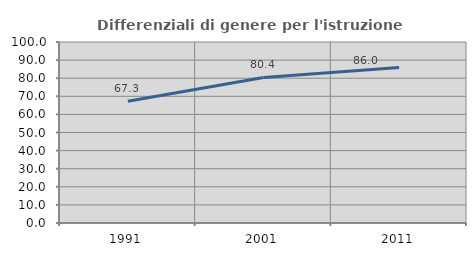
| Category | Differenziali di genere per l'istruzione superiore |
|---|---|
| 1991.0 | 67.315 |
| 2001.0 | 80.397 |
| 2011.0 | 85.96 |